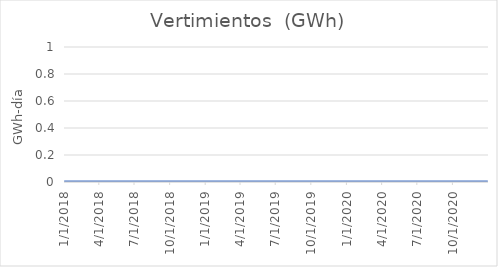
| Category | Vertimientos  (GWh) |
|---|---|
| 1/1/18 | 0 |
| 1/2/18 | 0 |
| 1/3/18 | 0 |
| 1/4/18 | 0 |
| 1/5/18 | 0 |
| 1/6/18 | 0 |
| 1/7/18 | 0 |
| 1/8/18 | 0 |
| 1/9/18 | 0 |
| 1/10/18 | 0 |
| 1/11/18 | 0 |
| 1/12/18 | 0 |
| 1/13/18 | 0 |
| 1/14/18 | 0 |
| 1/15/18 | 0 |
| 1/16/18 | 0 |
| 1/17/18 | 0 |
| 1/18/18 | 0 |
| 1/19/18 | 0 |
| 1/20/18 | 0 |
| 1/21/18 | 0 |
| 1/22/18 | 0 |
| 1/23/18 | 0 |
| 1/24/18 | 0 |
| 1/25/18 | 0 |
| 1/26/18 | 0 |
| 1/27/18 | 0 |
| 1/28/18 | 0 |
| 1/29/18 | 0 |
| 1/30/18 | 0 |
| 1/31/18 | 0 |
| 2/1/18 | 0 |
| 2/2/18 | 0 |
| 2/3/18 | 0 |
| 2/4/18 | 0 |
| 2/5/18 | 0 |
| 2/6/18 | 0 |
| 2/7/18 | 0 |
| 2/8/18 | 0 |
| 2/9/18 | 0 |
| 2/10/18 | 0 |
| 2/11/18 | 0 |
| 2/12/18 | 0 |
| 2/13/18 | 0 |
| 2/14/18 | 0 |
| 2/15/18 | 0 |
| 2/16/18 | 0 |
| 2/17/18 | 0 |
| 2/18/18 | 0 |
| 2/19/18 | 0 |
| 2/20/18 | 0 |
| 2/21/18 | 0 |
| 2/22/18 | 0 |
| 2/23/18 | 0 |
| 2/24/18 | 0 |
| 2/25/18 | 0 |
| 2/26/18 | 0 |
| 2/27/18 | 0 |
| 2/28/18 | 0 |
| 3/1/18 | 0 |
| 3/2/18 | 0 |
| 3/3/18 | 0 |
| 3/4/18 | 0 |
| 3/5/18 | 0 |
| 3/6/18 | 0 |
| 3/7/18 | 0 |
| 3/8/18 | 0 |
| 3/9/18 | 0 |
| 3/10/18 | 0 |
| 3/11/18 | 0 |
| 3/12/18 | 0 |
| 3/13/18 | 0 |
| 3/14/18 | 0 |
| 3/15/18 | 0 |
| 3/16/18 | 0 |
| 3/17/18 | 0 |
| 3/18/18 | 0 |
| 3/19/18 | 0 |
| 3/20/18 | 0 |
| 3/21/18 | 0 |
| 3/22/18 | 0 |
| 3/23/18 | 0 |
| 3/24/18 | 0 |
| 3/25/18 | 0 |
| 3/26/18 | 0 |
| 3/27/18 | 0 |
| 3/28/18 | 0 |
| 3/29/18 | 0 |
| 3/30/18 | 0 |
| 3/31/18 | 0 |
| 4/1/18 | 0 |
| 4/2/18 | 0 |
| 4/3/18 | 0 |
| 4/4/18 | 0 |
| 4/5/18 | 0 |
| 4/6/18 | 0 |
| 4/7/18 | 0 |
| 4/8/18 | 0 |
| 4/9/18 | 0 |
| 4/10/18 | 0 |
| 4/11/18 | 0 |
| 4/12/18 | 0 |
| 4/13/18 | 0 |
| 4/14/18 | 0 |
| 4/15/18 | 0 |
| 4/16/18 | 0 |
| 4/17/18 | 0 |
| 4/18/18 | 0 |
| 4/19/18 | 0 |
| 4/20/18 | 0 |
| 4/21/18 | 0 |
| 4/22/18 | 0 |
| 4/23/18 | 0 |
| 4/24/18 | 0 |
| 4/25/18 | 0 |
| 4/26/18 | 0 |
| 4/27/18 | 0 |
| 4/28/18 | 0 |
| 4/29/18 | 0 |
| 4/30/18 | 0 |
| 5/1/18 | 0 |
| 5/2/18 | 0 |
| 5/3/18 | 0 |
| 5/4/18 | 0 |
| 5/5/18 | 0 |
| 5/6/18 | 0 |
| 5/7/18 | 0 |
| 5/8/18 | 0 |
| 5/9/18 | 0 |
| 5/10/18 | 0 |
| 5/11/18 | 0 |
| 5/12/18 | 0 |
| 5/13/18 | 0 |
| 5/14/18 | 0 |
| 5/15/18 | 0 |
| 5/16/18 | 0 |
| 5/17/18 | 0 |
| 5/18/18 | 0 |
| 5/19/18 | 0 |
| 5/20/18 | 0 |
| 5/21/18 | 0 |
| 5/22/18 | 0 |
| 5/23/18 | 0 |
| 5/24/18 | 0 |
| 5/25/18 | 0 |
| 5/26/18 | 0 |
| 5/27/18 | 0 |
| 5/28/18 | 0 |
| 5/29/18 | 0 |
| 5/30/18 | 0 |
| 5/31/18 | 0 |
| 6/1/18 | 0 |
| 6/2/18 | 0 |
| 6/3/18 | 0 |
| 6/4/18 | 0 |
| 6/5/18 | 0 |
| 6/6/18 | 0 |
| 6/7/18 | 0 |
| 6/8/18 | 0 |
| 6/9/18 | 0 |
| 6/10/18 | 0 |
| 6/11/18 | 0 |
| 6/12/18 | 0 |
| 6/13/18 | 0 |
| 6/14/18 | 0 |
| 6/15/18 | 0 |
| 6/16/18 | 0 |
| 6/17/18 | 0 |
| 6/18/18 | 0 |
| 6/19/18 | 0 |
| 6/20/18 | 0 |
| 6/21/18 | 0 |
| 6/22/18 | 0 |
| 6/23/18 | 0 |
| 6/24/18 | 0 |
| 6/25/18 | 0 |
| 6/26/18 | 0 |
| 6/27/18 | 0 |
| 6/28/18 | 0 |
| 6/29/18 | 0 |
| 6/30/18 | 0 |
| 7/1/18 | 0 |
| 7/2/18 | 0 |
| 7/3/18 | 0 |
| 7/4/18 | 0 |
| 7/5/18 | 0 |
| 7/6/18 | 0 |
| 7/7/18 | 0 |
| 7/8/18 | 0 |
| 7/9/18 | 0 |
| 7/10/18 | 0 |
| 7/11/18 | 0 |
| 7/12/18 | 0 |
| 7/13/18 | 0 |
| 7/14/18 | 0 |
| 7/15/18 | 0 |
| 7/16/18 | 0 |
| 7/17/18 | 0 |
| 7/18/18 | 0 |
| 7/19/18 | 0 |
| 7/20/18 | 0 |
| 7/21/18 | 0 |
| 7/22/18 | 0 |
| 7/23/18 | 0 |
| 7/24/18 | 0 |
| 7/25/18 | 0 |
| 7/26/18 | 0 |
| 7/27/18 | 0 |
| 7/28/18 | 0 |
| 7/29/18 | 0 |
| 7/30/18 | 0 |
| 7/31/18 | 0 |
| 8/1/18 | 0 |
| 8/2/18 | 0 |
| 8/3/18 | 0 |
| 8/4/18 | 0 |
| 8/5/18 | 0 |
| 8/6/18 | 0 |
| 8/7/18 | 0 |
| 8/8/18 | 0 |
| 8/9/18 | 0 |
| 8/10/18 | 0 |
| 8/11/18 | 0 |
| 8/12/18 | 0 |
| 8/13/18 | 0 |
| 8/14/18 | 0 |
| 8/15/18 | 0 |
| 8/16/18 | 0 |
| 8/17/18 | 0 |
| 8/18/18 | 0 |
| 8/19/18 | 0 |
| 8/20/18 | 0 |
| 8/21/18 | 0 |
| 8/22/18 | 0 |
| 8/23/18 | 0 |
| 8/24/18 | 0 |
| 8/25/18 | 0 |
| 8/26/18 | 0 |
| 8/27/18 | 0 |
| 8/28/18 | 0 |
| 8/29/18 | 0 |
| 8/30/18 | 0 |
| 8/31/18 | 0 |
| 9/1/18 | 0 |
| 9/2/18 | 0 |
| 9/3/18 | 0 |
| 9/4/18 | 0 |
| 9/5/18 | 0 |
| 9/6/18 | 0 |
| 9/7/18 | 0 |
| 9/8/18 | 0 |
| 9/9/18 | 0 |
| 9/10/18 | 0 |
| 9/11/18 | 0 |
| 9/12/18 | 0 |
| 9/13/18 | 0 |
| 9/14/18 | 0 |
| 9/15/18 | 0 |
| 9/16/18 | 0 |
| 9/17/18 | 0 |
| 9/18/18 | 0 |
| 9/19/18 | 0 |
| 9/20/18 | 0 |
| 9/21/18 | 0 |
| 9/22/18 | 0 |
| 9/23/18 | 0 |
| 9/24/18 | 0 |
| 9/25/18 | 0 |
| 9/26/18 | 0 |
| 9/27/18 | 0 |
| 9/28/18 | 0 |
| 9/29/18 | 0 |
| 9/30/18 | 0 |
| 10/1/18 | 0 |
| 10/2/18 | 0 |
| 10/3/18 | 0 |
| 10/4/18 | 0 |
| 10/5/18 | 0 |
| 10/6/18 | 0 |
| 10/7/18 | 0 |
| 10/8/18 | 0 |
| 10/9/18 | 0 |
| 10/10/18 | 0 |
| 10/11/18 | 0 |
| 10/12/18 | 0 |
| 10/13/18 | 0 |
| 10/14/18 | 0 |
| 10/15/18 | 0 |
| 10/16/18 | 0 |
| 10/17/18 | 0 |
| 10/18/18 | 0 |
| 10/19/18 | 0 |
| 10/20/18 | 0 |
| 10/21/18 | 0 |
| 10/22/18 | 0 |
| 10/23/18 | 0 |
| 10/24/18 | 0 |
| 10/25/18 | 0 |
| 10/26/18 | 0 |
| 10/27/18 | 0 |
| 10/28/18 | 0 |
| 10/29/18 | 0 |
| 10/30/18 | 0 |
| 10/31/18 | 0 |
| 11/1/18 | 0 |
| 11/2/18 | 0 |
| 11/3/18 | 0 |
| 11/4/18 | 0 |
| 11/5/18 | 0 |
| 11/6/18 | 0 |
| 11/7/18 | 0 |
| 11/8/18 | 0 |
| 11/9/18 | 0 |
| 11/10/18 | 0 |
| 11/11/18 | 0 |
| 11/12/18 | 0 |
| 11/13/18 | 0 |
| 11/14/18 | 0 |
| 11/15/18 | 0 |
| 11/16/18 | 0 |
| 11/17/18 | 0 |
| 11/18/18 | 0 |
| 11/19/18 | 0 |
| 11/20/18 | 0 |
| 11/21/18 | 0 |
| 11/22/18 | 0 |
| 11/23/18 | 0 |
| 11/24/18 | 0 |
| 11/25/18 | 0 |
| 11/26/18 | 0 |
| 11/27/18 | 0 |
| 11/28/18 | 0 |
| 11/29/18 | 0 |
| 11/30/18 | 0 |
| 12/1/18 | 0 |
| 12/2/18 | 0 |
| 12/3/18 | 0 |
| 12/4/18 | 0 |
| 12/5/18 | 0 |
| 12/6/18 | 0 |
| 12/7/18 | 0 |
| 12/8/18 | 0 |
| 12/9/18 | 0 |
| 12/10/18 | 0 |
| 12/11/18 | 0 |
| 12/12/18 | 0 |
| 12/13/18 | 0 |
| 12/14/18 | 0 |
| 12/15/18 | 0 |
| 12/16/18 | 0 |
| 12/17/18 | 0 |
| 12/18/18 | 0 |
| 12/19/18 | 0 |
| 12/20/18 | 0 |
| 12/21/18 | 0 |
| 12/22/18 | 0 |
| 12/23/18 | 0 |
| 12/24/18 | 0 |
| 12/25/18 | 0 |
| 12/26/18 | 0 |
| 12/27/18 | 0 |
| 12/28/18 | 0 |
| 12/29/18 | 0 |
| 12/30/18 | 0 |
| 12/31/18 | 0 |
| 1/1/19 | 0 |
| 1/2/19 | 0 |
| 1/3/19 | 0 |
| 1/4/19 | 0 |
| 1/5/19 | 0 |
| 1/6/19 | 0 |
| 1/7/19 | 0 |
| 1/8/19 | 0 |
| 1/9/19 | 0 |
| 1/10/19 | 0 |
| 1/11/19 | 0 |
| 1/12/19 | 0 |
| 1/13/19 | 0 |
| 1/14/19 | 0 |
| 1/15/19 | 0 |
| 1/16/19 | 0 |
| 1/17/19 | 0 |
| 1/18/19 | 0 |
| 1/19/19 | 0 |
| 1/20/19 | 0 |
| 1/21/19 | 0 |
| 1/22/19 | 0 |
| 1/23/19 | 0 |
| 1/24/19 | 0 |
| 1/25/19 | 0 |
| 1/26/19 | 0 |
| 1/27/19 | 0 |
| 1/28/19 | 0 |
| 1/29/19 | 0 |
| 1/30/19 | 0 |
| 1/31/19 | 0 |
| 2/1/19 | 0 |
| 2/2/19 | 0 |
| 2/3/19 | 0 |
| 2/4/19 | 0 |
| 2/5/19 | 0 |
| 2/6/19 | 0 |
| 2/7/19 | 0 |
| 2/8/19 | 0 |
| 2/9/19 | 0 |
| 2/10/19 | 0 |
| 2/11/19 | 0 |
| 2/12/19 | 0 |
| 2/13/19 | 0 |
| 2/14/19 | 0 |
| 2/15/19 | 0 |
| 2/16/19 | 0 |
| 2/17/19 | 0 |
| 2/18/19 | 0 |
| 2/19/19 | 0 |
| 2/20/19 | 0 |
| 2/21/19 | 0 |
| 2/22/19 | 0 |
| 2/23/19 | 0 |
| 2/24/19 | 0 |
| 2/25/19 | 0 |
| 2/26/19 | 0 |
| 2/27/19 | 0 |
| 2/28/19 | 0 |
| 3/1/19 | 0 |
| 3/2/19 | 0 |
| 3/3/19 | 0 |
| 3/4/19 | 0 |
| 3/5/19 | 0 |
| 3/6/19 | 0 |
| 3/7/19 | 0 |
| 3/8/19 | 0 |
| 3/9/19 | 0 |
| 3/10/19 | 0 |
| 3/11/19 | 0 |
| 3/12/19 | 0 |
| 3/13/19 | 0 |
| 3/14/19 | 0 |
| 3/15/19 | 0 |
| 3/16/19 | 0 |
| 3/17/19 | 0 |
| 3/18/19 | 0 |
| 3/19/19 | 0 |
| 3/20/19 | 0 |
| 3/21/19 | 0 |
| 3/22/19 | 0 |
| 3/23/19 | 0 |
| 3/24/19 | 0 |
| 3/25/19 | 0 |
| 3/26/19 | 0 |
| 3/27/19 | 0 |
| 3/28/19 | 0 |
| 3/29/19 | 0 |
| 3/30/19 | 0 |
| 3/31/19 | 0 |
| 4/1/19 | 0 |
| 4/2/19 | 0 |
| 4/3/19 | 0 |
| 4/4/19 | 0 |
| 4/5/19 | 0 |
| 4/6/19 | 0 |
| 4/7/19 | 0 |
| 4/8/19 | 0 |
| 4/9/19 | 0 |
| 4/10/19 | 0 |
| 4/11/19 | 0 |
| 4/12/19 | 0 |
| 4/13/19 | 0 |
| 4/14/19 | 0 |
| 4/15/19 | 0 |
| 4/16/19 | 0 |
| 4/17/19 | 0 |
| 4/18/19 | 0 |
| 4/19/19 | 0 |
| 4/20/19 | 0 |
| 4/21/19 | 0 |
| 4/22/19 | 0 |
| 4/23/19 | 0 |
| 4/24/19 | 0 |
| 4/25/19 | 0 |
| 4/26/19 | 0 |
| 4/27/19 | 0 |
| 4/28/19 | 0 |
| 4/29/19 | 0 |
| 4/30/19 | 0 |
| 5/1/19 | 0 |
| 5/2/19 | 0 |
| 5/3/19 | 0 |
| 5/4/19 | 0 |
| 5/5/19 | 0 |
| 5/6/19 | 0 |
| 5/7/19 | 0 |
| 5/8/19 | 0 |
| 5/9/19 | 0 |
| 5/10/19 | 0 |
| 5/11/19 | 0 |
| 5/12/19 | 0 |
| 5/13/19 | 0 |
| 5/14/19 | 0 |
| 5/15/19 | 0 |
| 5/16/19 | 0 |
| 5/17/19 | 0 |
| 5/18/19 | 0 |
| 5/19/19 | 0 |
| 5/20/19 | 0 |
| 5/21/19 | 0 |
| 5/22/19 | 0 |
| 5/23/19 | 0 |
| 5/24/19 | 0 |
| 5/25/19 | 0 |
| 5/26/19 | 0 |
| 5/27/19 | 0 |
| 5/28/19 | 0 |
| 5/29/19 | 0 |
| 5/30/19 | 0 |
| 5/31/19 | 0 |
| 6/1/19 | 0 |
| 6/2/19 | 0 |
| 6/3/19 | 0 |
| 6/4/19 | 0 |
| 6/5/19 | 0 |
| 6/6/19 | 0 |
| 6/7/19 | 0 |
| 6/8/19 | 0 |
| 6/9/19 | 0 |
| 6/10/19 | 0 |
| 6/11/19 | 0 |
| 6/12/19 | 0 |
| 6/13/19 | 0 |
| 6/14/19 | 0 |
| 6/15/19 | 0 |
| 6/16/19 | 0 |
| 6/17/19 | 0 |
| 6/18/19 | 0 |
| 6/19/19 | 0 |
| 6/20/19 | 0 |
| 6/21/19 | 0 |
| 6/22/19 | 0 |
| 6/23/19 | 0 |
| 6/24/19 | 0 |
| 6/25/19 | 0 |
| 6/26/19 | 0 |
| 6/27/19 | 0 |
| 6/28/19 | 0 |
| 6/29/19 | 0 |
| 6/30/19 | 0 |
| 7/1/19 | 0 |
| 7/2/19 | 0 |
| 7/3/19 | 0 |
| 7/4/19 | 0 |
| 7/5/19 | 0 |
| 7/6/19 | 0 |
| 7/7/19 | 0 |
| 7/8/19 | 0 |
| 7/9/19 | 0 |
| 7/10/19 | 0 |
| 7/11/19 | 0 |
| 7/12/19 | 0 |
| 7/13/19 | 0 |
| 7/14/19 | 0 |
| 7/15/19 | 0 |
| 7/16/19 | 0 |
| 7/17/19 | 0 |
| 7/18/19 | 0 |
| 7/19/19 | 0 |
| 7/20/19 | 0 |
| 7/21/19 | 0 |
| 7/22/19 | 0 |
| 7/23/19 | 0 |
| 7/24/19 | 0 |
| 7/25/19 | 0 |
| 7/26/19 | 0 |
| 7/27/19 | 0 |
| 7/28/19 | 0 |
| 7/29/19 | 0 |
| 7/30/19 | 0 |
| 7/31/19 | 0 |
| 8/1/19 | 0 |
| 8/2/19 | 0 |
| 8/3/19 | 0 |
| 8/4/19 | 0 |
| 8/5/19 | 0 |
| 8/6/19 | 0 |
| 8/7/19 | 0 |
| 8/8/19 | 0 |
| 8/9/19 | 0 |
| 8/10/19 | 0 |
| 8/11/19 | 0 |
| 8/12/19 | 0 |
| 8/13/19 | 0 |
| 8/14/19 | 0 |
| 8/15/19 | 0 |
| 8/16/19 | 0 |
| 8/17/19 | 0 |
| 8/18/19 | 0 |
| 8/19/19 | 0 |
| 8/20/19 | 0 |
| 8/21/19 | 0 |
| 8/22/19 | 0 |
| 8/23/19 | 0 |
| 8/24/19 | 0 |
| 8/25/19 | 0 |
| 8/26/19 | 0 |
| 8/27/19 | 0 |
| 8/28/19 | 0 |
| 8/29/19 | 0 |
| 8/30/19 | 0 |
| 8/31/19 | 0 |
| 9/1/19 | 0 |
| 9/2/19 | 0 |
| 9/3/19 | 0 |
| 9/4/19 | 0 |
| 9/5/19 | 0 |
| 9/6/19 | 0 |
| 9/7/19 | 0 |
| 9/8/19 | 0 |
| 9/9/19 | 0 |
| 9/10/19 | 0 |
| 9/11/19 | 0 |
| 9/12/19 | 0 |
| 9/13/19 | 0 |
| 9/14/19 | 0 |
| 9/15/19 | 0 |
| 9/16/19 | 0 |
| 9/17/19 | 0 |
| 9/18/19 | 0 |
| 9/19/19 | 0 |
| 9/20/19 | 0 |
| 9/21/19 | 0 |
| 9/22/19 | 0 |
| 9/23/19 | 0 |
| 9/24/19 | 0 |
| 9/25/19 | 0 |
| 9/26/19 | 0 |
| 9/27/19 | 0 |
| 9/28/19 | 0 |
| 9/29/19 | 0 |
| 9/30/19 | 0 |
| 10/1/19 | 0 |
| 10/2/19 | 0 |
| 10/3/19 | 0 |
| 10/4/19 | 0 |
| 10/5/19 | 0 |
| 10/6/19 | 0 |
| 10/7/19 | 0 |
| 10/8/19 | 0 |
| 10/9/19 | 0 |
| 10/10/19 | 0 |
| 10/11/19 | 0 |
| 10/12/19 | 0 |
| 10/13/19 | 0 |
| 10/14/19 | 0 |
| 10/15/19 | 0 |
| 10/16/19 | 0 |
| 10/17/19 | 0 |
| 10/18/19 | 0 |
| 10/19/19 | 0 |
| 10/20/19 | 0 |
| 10/21/19 | 0 |
| 10/22/19 | 0 |
| 10/23/19 | 0 |
| 10/24/19 | 0 |
| 10/25/19 | 0 |
| 10/26/19 | 0 |
| 10/27/19 | 0 |
| 10/28/19 | 0 |
| 10/29/19 | 0 |
| 10/30/19 | 0 |
| 10/31/19 | 0 |
| 11/1/19 | 0 |
| 11/2/19 | 0 |
| 11/3/19 | 0 |
| 11/4/19 | 0 |
| 11/5/19 | 0 |
| 11/6/19 | 0 |
| 11/7/19 | 0 |
| 11/8/19 | 0 |
| 11/9/19 | 0 |
| 11/10/19 | 0 |
| 11/11/19 | 0 |
| 11/12/19 | 0 |
| 11/13/19 | 0 |
| 11/14/19 | 0 |
| 11/15/19 | 0 |
| 11/16/19 | 0 |
| 11/17/19 | 0 |
| 11/18/19 | 0 |
| 11/19/19 | 0 |
| 11/20/19 | 0 |
| 11/21/19 | 0 |
| 11/22/19 | 0 |
| 11/23/19 | 0 |
| 11/24/19 | 0 |
| 11/25/19 | 0 |
| 11/26/19 | 0 |
| 11/27/19 | 0 |
| 11/28/19 | 0 |
| 11/29/19 | 0 |
| 11/30/19 | 0 |
| 12/1/19 | 0 |
| 12/2/19 | 0 |
| 12/3/19 | 0 |
| 12/4/19 | 0 |
| 12/5/19 | 0 |
| 12/6/19 | 0 |
| 12/7/19 | 0 |
| 12/8/19 | 0 |
| 12/9/19 | 0 |
| 12/10/19 | 0 |
| 12/11/19 | 0 |
| 12/12/19 | 0 |
| 12/13/19 | 0 |
| 12/14/19 | 0 |
| 12/15/19 | 0 |
| 12/16/19 | 0 |
| 12/17/19 | 0 |
| 12/18/19 | 0 |
| 12/19/19 | 0 |
| 12/20/19 | 0 |
| 12/21/19 | 0 |
| 12/22/19 | 0 |
| 12/23/19 | 0 |
| 12/24/19 | 0 |
| 12/25/19 | 0 |
| 12/26/19 | 0 |
| 12/27/19 | 0 |
| 12/28/19 | 0 |
| 12/29/19 | 0 |
| 12/30/19 | 0 |
| 12/31/19 | 0 |
| 1/1/20 | 0 |
| 1/2/20 | 0 |
| 1/3/20 | 0 |
| 1/4/20 | 0 |
| 1/5/20 | 0 |
| 1/6/20 | 0 |
| 1/7/20 | 0 |
| 1/8/20 | 0 |
| 1/9/20 | 0 |
| 1/10/20 | 0 |
| 1/11/20 | 0 |
| 1/12/20 | 0 |
| 1/13/20 | 0 |
| 1/14/20 | 0 |
| 1/15/20 | 0 |
| 1/16/20 | 0 |
| 1/17/20 | 0 |
| 1/18/20 | 0 |
| 1/19/20 | 0 |
| 1/20/20 | 0 |
| 1/21/20 | 0 |
| 1/22/20 | 0 |
| 1/23/20 | 0 |
| 1/24/20 | 0 |
| 1/25/20 | 0 |
| 1/26/20 | 0 |
| 1/27/20 | 0 |
| 1/28/20 | 0 |
| 1/29/20 | 0 |
| 1/30/20 | 0 |
| 1/31/20 | 0 |
| 2/1/20 | 0 |
| 2/2/20 | 0 |
| 2/3/20 | 0 |
| 2/4/20 | 0 |
| 2/5/20 | 0 |
| 2/6/20 | 0 |
| 2/7/20 | 0 |
| 2/8/20 | 0 |
| 2/9/20 | 0 |
| 2/10/20 | 0 |
| 2/11/20 | 0 |
| 2/12/20 | 0 |
| 2/13/20 | 0 |
| 2/14/20 | 0 |
| 2/15/20 | 0 |
| 2/16/20 | 0 |
| 2/17/20 | 0 |
| 2/18/20 | 0 |
| 2/19/20 | 0 |
| 2/20/20 | 0 |
| 2/21/20 | 0 |
| 2/22/20 | 0 |
| 2/23/20 | 0 |
| 2/24/20 | 0 |
| 2/25/20 | 0 |
| 2/26/20 | 0 |
| 2/27/20 | 0 |
| 2/28/20 | 0 |
| 2/29/20 | 0 |
| 3/1/20 | 0 |
| 3/2/20 | 0 |
| 3/3/20 | 0 |
| 3/4/20 | 0 |
| 3/5/20 | 0 |
| 3/6/20 | 0 |
| 3/7/20 | 0 |
| 3/8/20 | 0 |
| 3/9/20 | 0 |
| 3/10/20 | 0 |
| 3/11/20 | 0 |
| 3/12/20 | 0 |
| 3/13/20 | 0 |
| 3/14/20 | 0 |
| 3/15/20 | 0 |
| 3/16/20 | 0 |
| 3/17/20 | 0 |
| 3/18/20 | 0 |
| 3/19/20 | 0 |
| 3/20/20 | 0 |
| 3/21/20 | 0 |
| 3/22/20 | 0 |
| 3/23/20 | 0 |
| 3/24/20 | 0 |
| 3/25/20 | 0 |
| 3/26/20 | 0 |
| 3/27/20 | 0 |
| 3/28/20 | 0 |
| 3/29/20 | 0 |
| 3/30/20 | 0 |
| 3/31/20 | 0 |
| 4/1/20 | 0 |
| 4/2/20 | 0 |
| 4/3/20 | 0 |
| 4/4/20 | 0 |
| 4/5/20 | 0 |
| 4/6/20 | 0 |
| 4/7/20 | 0 |
| 4/8/20 | 0 |
| 4/9/20 | 0 |
| 4/10/20 | 0 |
| 4/11/20 | 0 |
| 4/12/20 | 0 |
| 4/13/20 | 0 |
| 4/14/20 | 0 |
| 4/15/20 | 0 |
| 4/16/20 | 0 |
| 4/17/20 | 0 |
| 4/18/20 | 0 |
| 4/19/20 | 0 |
| 4/20/20 | 0 |
| 4/21/20 | 0 |
| 4/22/20 | 0 |
| 4/23/20 | 0 |
| 4/24/20 | 0 |
| 4/25/20 | 0 |
| 4/26/20 | 0 |
| 4/27/20 | 0 |
| 4/28/20 | 0 |
| 4/29/20 | 0 |
| 4/30/20 | 0 |
| 5/1/20 | 0 |
| 5/2/20 | 0 |
| 5/3/20 | 0 |
| 5/4/20 | 0 |
| 5/5/20 | 0 |
| 5/6/20 | 0 |
| 5/7/20 | 0 |
| 5/8/20 | 0 |
| 5/9/20 | 0 |
| 5/10/20 | 0 |
| 5/11/20 | 0 |
| 5/12/20 | 0 |
| 5/13/20 | 0 |
| 5/14/20 | 0 |
| 5/15/20 | 0 |
| 5/16/20 | 0 |
| 5/17/20 | 0 |
| 5/18/20 | 0 |
| 5/19/20 | 0 |
| 5/20/20 | 0 |
| 5/21/20 | 0 |
| 5/22/20 | 0 |
| 5/23/20 | 0 |
| 5/24/20 | 0 |
| 5/25/20 | 0 |
| 5/26/20 | 0 |
| 5/27/20 | 0 |
| 5/28/20 | 0 |
| 5/29/20 | 0 |
| 5/30/20 | 0 |
| 5/31/20 | 0 |
| 6/1/20 | 0 |
| 6/2/20 | 0 |
| 6/3/20 | 0 |
| 6/4/20 | 0 |
| 6/5/20 | 0 |
| 6/6/20 | 0 |
| 6/7/20 | 0 |
| 6/8/20 | 0 |
| 6/9/20 | 0 |
| 6/10/20 | 0 |
| 6/11/20 | 0 |
| 6/12/20 | 0 |
| 6/13/20 | 0 |
| 6/14/20 | 0 |
| 6/15/20 | 0 |
| 6/16/20 | 0 |
| 6/17/20 | 0 |
| 6/18/20 | 0 |
| 6/19/20 | 0 |
| 6/20/20 | 0 |
| 6/21/20 | 0 |
| 6/22/20 | 0 |
| 6/23/20 | 0 |
| 6/24/20 | 0 |
| 6/25/20 | 0 |
| 6/26/20 | 0 |
| 6/27/20 | 0 |
| 6/28/20 | 0 |
| 6/29/20 | 0 |
| 6/30/20 | 0 |
| 7/1/20 | 0 |
| 7/2/20 | 0 |
| 7/3/20 | 0 |
| 7/4/20 | 0 |
| 7/5/20 | 0 |
| 7/6/20 | 0 |
| 7/7/20 | 0 |
| 7/8/20 | 0 |
| 7/9/20 | 0 |
| 7/10/20 | 0 |
| 7/11/20 | 0 |
| 7/12/20 | 0 |
| 7/13/20 | 0 |
| 7/14/20 | 0 |
| 7/15/20 | 0 |
| 7/16/20 | 0 |
| 7/17/20 | 0 |
| 7/18/20 | 0 |
| 7/19/20 | 0 |
| 7/20/20 | 0 |
| 7/21/20 | 0 |
| 7/22/20 | 0 |
| 7/23/20 | 0 |
| 7/24/20 | 0 |
| 7/25/20 | 0 |
| 7/26/20 | 0 |
| 7/27/20 | 0 |
| 7/28/20 | 0 |
| 7/29/20 | 0 |
| 7/30/20 | 0 |
| 7/31/20 | 0 |
| 8/1/20 | 0 |
| 8/2/20 | 0 |
| 8/3/20 | 0 |
| 8/4/20 | 0 |
| 8/5/20 | 0 |
| 8/6/20 | 0 |
| 8/7/20 | 0 |
| 8/8/20 | 0 |
| 8/9/20 | 0 |
| 8/10/20 | 0 |
| 8/11/20 | 0 |
| 8/12/20 | 0 |
| 8/13/20 | 0 |
| 8/14/20 | 0 |
| 8/15/20 | 0 |
| 8/16/20 | 0 |
| 8/17/20 | 0 |
| 8/18/20 | 0 |
| 8/19/20 | 0 |
| 8/20/20 | 0 |
| 8/21/20 | 0 |
| 8/22/20 | 0 |
| 8/23/20 | 0 |
| 8/24/20 | 0 |
| 8/25/20 | 0 |
| 8/26/20 | 0 |
| 8/27/20 | 0 |
| 8/28/20 | 0 |
| 8/29/20 | 0 |
| 8/30/20 | 0 |
| 8/31/20 | 0 |
| 9/1/20 | 0 |
| 9/2/20 | 0 |
| 9/3/20 | 0 |
| 9/4/20 | 0 |
| 9/5/20 | 0 |
| 9/6/20 | 0 |
| 9/7/20 | 0 |
| 9/8/20 | 0 |
| 9/9/20 | 0 |
| 9/10/20 | 0 |
| 9/11/20 | 0 |
| 9/12/20 | 0 |
| 9/13/20 | 0 |
| 9/14/20 | 0 |
| 9/15/20 | 0 |
| 9/16/20 | 0 |
| 9/17/20 | 0 |
| 9/18/20 | 0 |
| 9/19/20 | 0 |
| 9/20/20 | 0 |
| 9/21/20 | 0 |
| 9/22/20 | 0 |
| 9/23/20 | 0 |
| 9/24/20 | 0 |
| 9/25/20 | 0 |
| 9/26/20 | 0 |
| 9/27/20 | 0 |
| 9/28/20 | 0 |
| 9/29/20 | 0 |
| 9/30/20 | 0 |
| 10/1/20 | 0 |
| 10/2/20 | 0 |
| 10/3/20 | 0 |
| 10/4/20 | 0 |
| 10/5/20 | 0 |
| 10/6/20 | 0 |
| 10/7/20 | 0 |
| 10/8/20 | 0 |
| 10/9/20 | 0 |
| 10/10/20 | 0 |
| 10/11/20 | 0 |
| 10/12/20 | 0 |
| 10/13/20 | 0 |
| 10/14/20 | 0 |
| 10/15/20 | 0 |
| 10/16/20 | 0 |
| 10/17/20 | 0 |
| 10/18/20 | 0 |
| 10/19/20 | 0 |
| 10/20/20 | 0 |
| 10/21/20 | 0 |
| 10/22/20 | 0 |
| 10/23/20 | 0 |
| 10/24/20 | 0 |
| 10/25/20 | 0 |
| 10/26/20 | 0 |
| 10/27/20 | 0 |
| 10/28/20 | 0 |
| 10/29/20 | 0 |
| 10/30/20 | 0 |
| 10/31/20 | 0 |
| 11/1/20 | 0 |
| 11/2/20 | 0 |
| 11/3/20 | 0 |
| 11/4/20 | 0 |
| 11/5/20 | 0 |
| 11/6/20 | 0 |
| 11/7/20 | 0 |
| 11/8/20 | 0 |
| 11/9/20 | 0 |
| 11/10/20 | 0 |
| 11/11/20 | 0 |
| 11/12/20 | 0 |
| 11/13/20 | 0 |
| 11/14/20 | 0 |
| 11/15/20 | 0 |
| 11/16/20 | 0 |
| 11/17/20 | 0 |
| 11/18/20 | 0 |
| 11/19/20 | 0 |
| 11/20/20 | 0 |
| 11/21/20 | 0 |
| 11/22/20 | 0 |
| 11/23/20 | 0 |
| 11/24/20 | 0 |
| 11/25/20 | 0 |
| 11/26/20 | 0 |
| 11/27/20 | 0 |
| 11/28/20 | 0 |
| 11/29/20 | 0 |
| 11/30/20 | 0 |
| 12/1/20 | 0 |
| 12/2/20 | 0 |
| 12/3/20 | 0 |
| 12/4/20 | 0 |
| 12/5/20 | 0 |
| 12/6/20 | 0 |
| 12/7/20 | 0 |
| 12/8/20 | 0 |
| 12/9/20 | 0 |
| 12/10/20 | 0 |
| 12/11/20 | 0 |
| 12/12/20 | 0 |
| 12/13/20 | 0 |
| 12/14/20 | 0 |
| 12/15/20 | 0 |
| 12/16/20 | 0 |
| 12/17/20 | 0 |
| 12/18/20 | 0 |
| 12/19/20 | 0 |
| 12/20/20 | 0 |
| 12/21/20 | 0 |
| 12/22/20 | 0 |
| 12/23/20 | 0 |
| 12/24/20 | 0 |
| 12/25/20 | 0 |
| 12/26/20 | 0 |
| 12/27/20 | 0 |
| 12/28/20 | 0 |
| 12/29/20 | 0 |
| 12/30/20 | 0 |
| 12/31/20 | 0 |